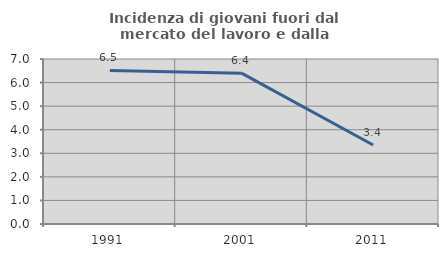
| Category | Incidenza di giovani fuori dal mercato del lavoro e dalla formazione  |
|---|---|
| 1991.0 | 6.515 |
| 2001.0 | 6.4 |
| 2011.0 | 3.352 |